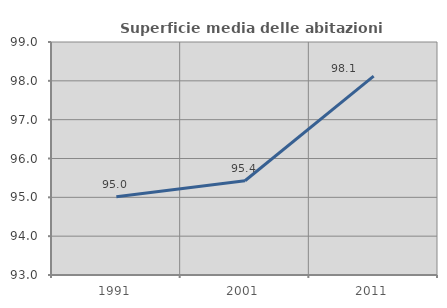
| Category | Superficie media delle abitazioni occupate |
|---|---|
| 1991.0 | 95.015 |
| 2001.0 | 95.427 |
| 2011.0 | 98.121 |